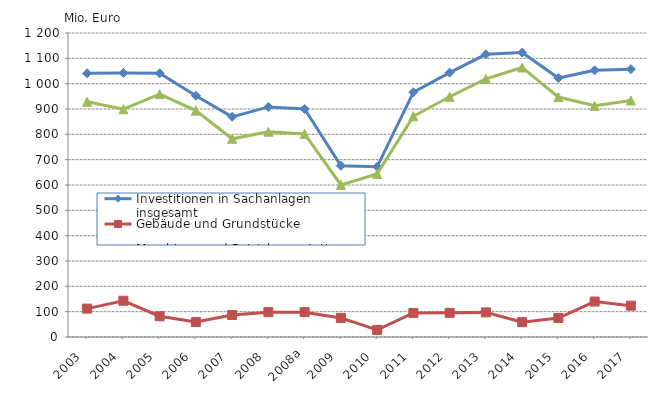
| Category | Investitionen in Sachanlagen insgesamt | Gebäude und Grundstücke | Maschinen und Betriebsausstattung |
|---|---|---|---|
| 2003  | 1040673 | 112131 | 928542 |
| 2004  | 1042199 | 143093 | 899107 |
| 2005  | 1040771 | 81943 | 958828 |
| 2006  | 952585 | 59050 | 893535 |
| 2007  | 869086 | 86618 | 782467 |
| 2008  | 908294 | 98112 | 810182 |
| 2008a | 899839 | 98112 | 801727 |
| 2009  | 675811 | 75418 | 600393 |
| 2010  | 671734.109 | 27895.396 | 643838.713 |
| 2011  | 966215.121 | 94979.882 | 871235.239 |
| 2012  | 1043637.405 | 95334.066 | 948303.339 |
| 2013  | 1115956.006 | 97198.2 | 1018757.806 |
| 2014  | 1122553.349 | 58554.558 | 1063998.791 |
| 2015  | 1022095.197 | 75014.669 | 947080.528 |
| 2016  | 1052570.21 | 139988.972 | 912581.238 |
| 2017  | 1057379.348 | 123665.469 | 933713.879 |